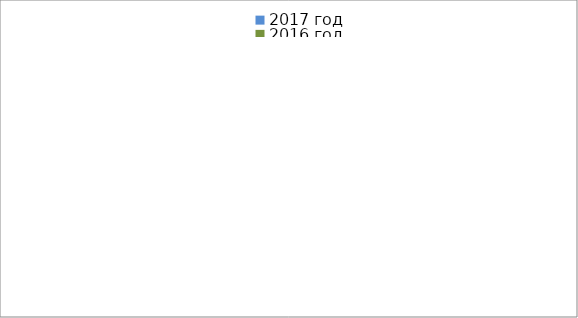
| Category | 2017 год | 2016 год |
|---|---|---|
|  - поджог | 17 | 41 |
|  - неосторожное обращение с огнём | 7 | 22 |
|  - НПТЭ электрооборудования | 26 | 21 |
|  - НПУ и Э печей | 47 | 33 |
|  - НПУ и Э транспортных средств | 45 | 33 |
|   -Шалость с огнем детей | 4 | 6 |
|  -НППБ при эксплуатации эл.приборов | 24 | 16 |
|  - курение | 37 | 31 |
| - прочие | 73 | 96 |
| - не установленные причины | 0 | 12 |